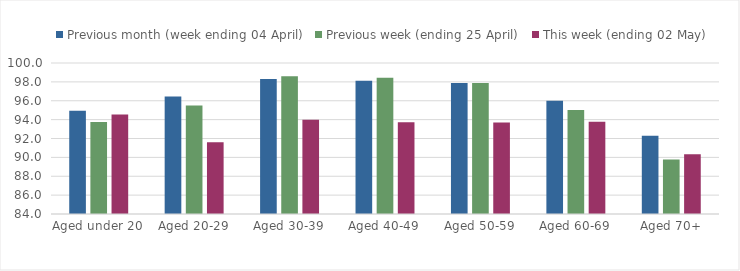
| Category | Previous month (week ending 04 April) | Previous week (ending 25 April) | This week (ending 02 May) |
|---|---|---|---|
| Aged under 20 | 94.935 | 93.74 | 94.544 |
| Aged 20-29 | 96.452 | 95.486 | 91.604 |
| Aged 30-39 | 98.292 | 98.609 | 93.981 |
| Aged 40-49 | 98.114 | 98.445 | 93.717 |
| Aged 50-59 | 97.881 | 97.878 | 93.69 |
| Aged 60-69 | 95.998 | 95.022 | 93.782 |
| Aged 70+ | 92.28 | 89.775 | 90.342 |